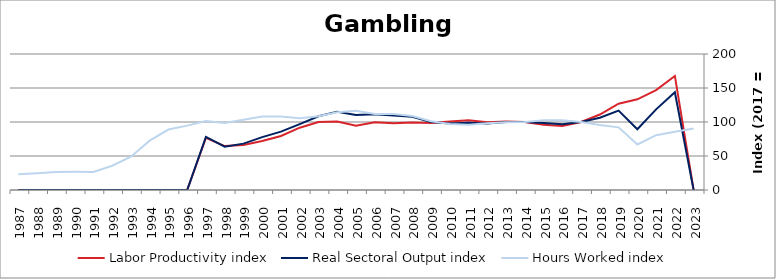
| Category | Labor Productivity index | Real Sectoral Output index | Hours Worked index |
|---|---|---|---|
| 2023.0 | 0 | 0 | 90.502 |
| 2022.0 | 167.763 | 143.682 | 85.646 |
| 2021.0 | 147.022 | 118.581 | 80.655 |
| 2020.0 | 133.347 | 89.337 | 66.996 |
| 2019.0 | 126.83 | 116.802 | 92.093 |
| 2018.0 | 111.005 | 106.17 | 95.645 |
| 2017.0 | 100 | 100 | 100 |
| 2016.0 | 94.303 | 96.572 | 102.406 |
| 2015.0 | 95.929 | 98.373 | 102.548 |
| 2014.0 | 99.945 | 99.839 | 99.894 |
| 2013.0 | 100.673 | 100.148 | 99.479 |
| 2012.0 | 99.623 | 97.849 | 98.22 |
| 2011.0 | 102.735 | 98.72 | 96.092 |
| 2010.0 | 100.824 | 97.764 | 96.965 |
| 2009.0 | 98.688 | 99.912 | 101.241 |
| 2008.0 | 99.201 | 107.8 | 108.668 |
| 2007.0 | 98.08 | 109.467 | 111.61 |
| 2006.0 | 99.764 | 111.554 | 111.817 |
| 2005.0 | 94.677 | 110.217 | 116.414 |
| 2004.0 | 100.791 | 115.192 | 114.288 |
| 2003.0 | 100.085 | 108.409 | 108.317 |
| 2002.0 | 91.625 | 96.768 | 105.614 |
| 2001.0 | 79.432 | 85.799 | 108.016 |
| 2000.0 | 71.943 | 77.707 | 108.01 |
| 1999.0 | 66.062 | 68.2 | 103.236 |
| 1998.0 | 64.633 | 63.65 | 98.479 |
| 1997.0 | 76.84 | 77.995 | 101.503 |
| 1996.0 | 0 | 0 | 94.643 |
| 1995.0 | 0 | 0 | 88.881 |
| 1994.0 | 0 | 0 | 72.585 |
| 1993.0 | 0 | 0 | 48.961 |
| 1992.0 | 0 | 0 | 35.688 |
| 1991.0 | 0 | 0 | 26.474 |
| 1990.0 | 0 | 0 | 26.661 |
| 1989.0 | 0 | 0 | 26.418 |
| 1988.0 | 0 | 0 | 24.701 |
| 1987.0 | 0 | 0 | 23.322 |